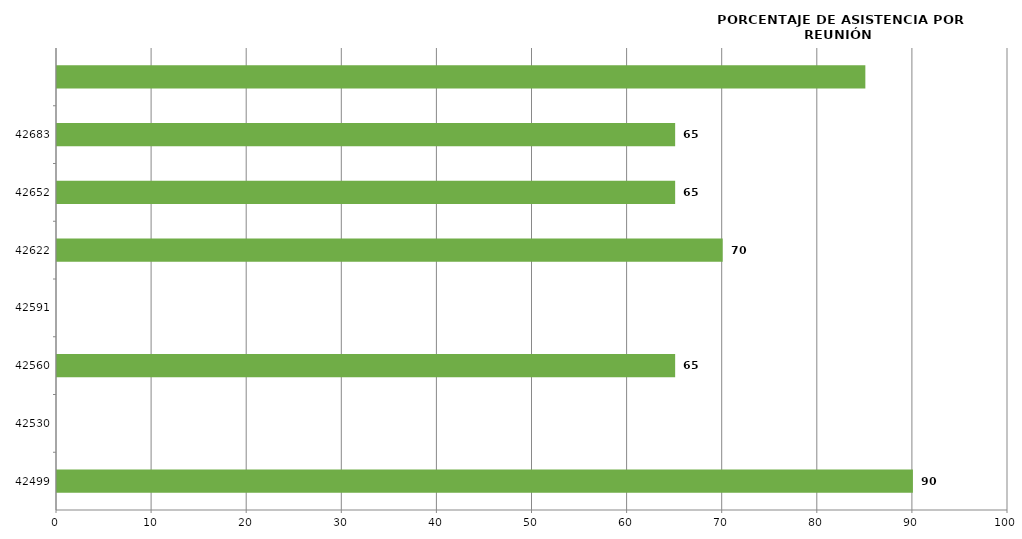
| Category | Series 0 |
|---|---|
| 42499.0 | 90 |
| 42556.0 | 65 |
| 42619.0 | 70 |
| 42647.0 | 65 |
| 42682.0 | 65 |
| 42710.0 | 85 |